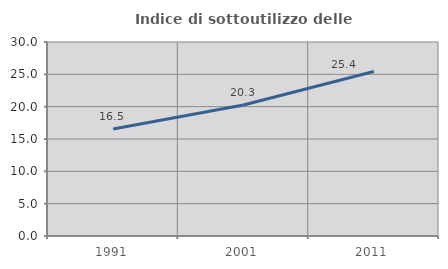
| Category | Indice di sottoutilizzo delle abitazioni  |
|---|---|
| 1991.0 | 16.549 |
| 2001.0 | 20.255 |
| 2011.0 | 25.43 |